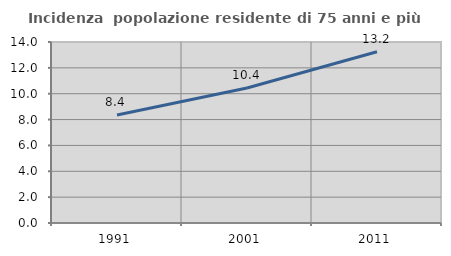
| Category | Incidenza  popolazione residente di 75 anni e più |
|---|---|
| 1991.0 | 8.355 |
| 2001.0 | 10.44 |
| 2011.0 | 13.248 |